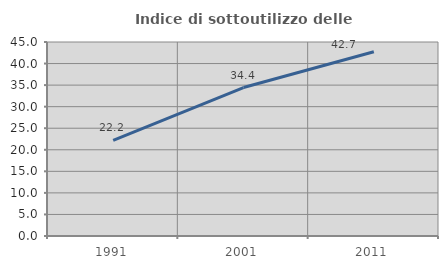
| Category | Indice di sottoutilizzo delle abitazioni  |
|---|---|
| 1991.0 | 22.16 |
| 2001.0 | 34.434 |
| 2011.0 | 42.742 |